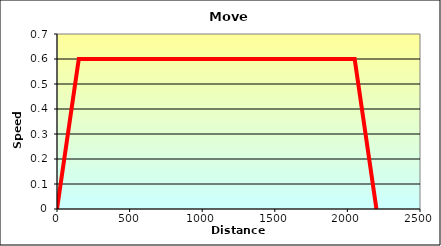
| Category | Series 0 |
|---|---|
| 0.0 | 0 |
| 150.0 | 0.6 |
| 2050.0000000000005 | 0.6 |
| 2200.0 | 0 |